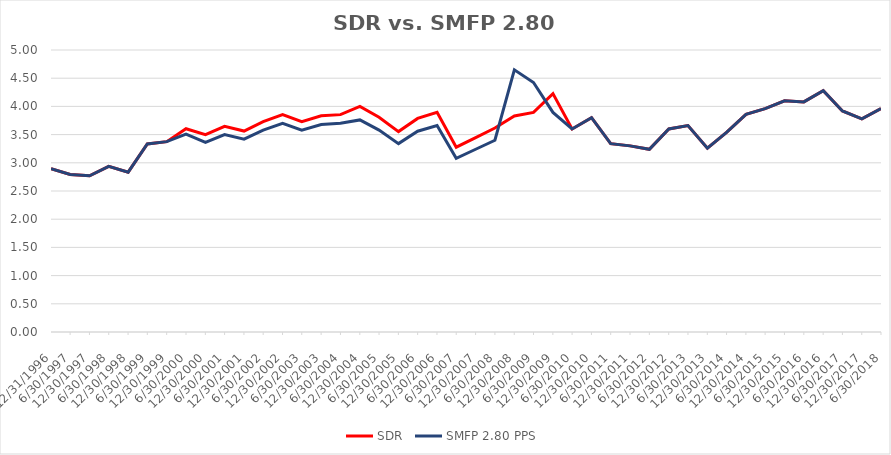
| Category | SDR | SMFP 2.80 PPS |
|---|---|---|
| 12/31/96 | 2.896 | 2.896 |
| 6/30/97 | 2.792 | 2.792 |
| 12/31/97 | 2.771 | 2.771 |
| 6/30/98 | 2.938 | 2.938 |
| 12/31/98 | 2.833 | 2.833 |
| 6/30/99 | 3.333 | 3.333 |
| 12/31/99 | 3.375 | 3.375 |
| 6/30/00 | 3.604 | 3.509 |
| 12/31/00 | 3.5 | 3.36 |
| 6/30/01 | 3.646 | 3.5 |
| 12/31/01 | 3.562 | 3.42 |
| 6/30/02 | 3.729 | 3.58 |
| 12/31/02 | 3.854 | 3.7 |
| 6/30/03 | 3.729 | 3.58 |
| 12/31/03 | 3.833 | 3.68 |
| 6/30/04 | 3.854 | 3.7 |
| 12/31/04 | 4 | 3.76 |
| 6/30/05 | 3.809 | 3.58 |
| 12/31/05 | 3.553 | 3.34 |
| 6/30/06 | 3.787 | 3.56 |
| 12/31/06 | 3.894 | 3.66 |
| 6/30/07 | 3.277 | 3.08 |
| 12/31/07 | 3.447 | 3.24 |
| 6/30/08 | 3.617 | 3.4 |
| 12/31/08 | 3.83 | 4.649 |
| 6/30/09 | 3.894 | 4.423 |
| 12/31/09 | 4.227 | 3.893 |
| 6/30/10 | 3.6 | 3.6 |
| 12/31/10 | 3.8 | 3.8 |
| 6/30/11 | 3.34 | 3.34 |
| 12/31/11 | 3.3 | 3.3 |
| 6/30/12 | 3.24 | 3.24 |
| 12/31/12 | 3.6 | 3.6 |
| 6/30/13 | 3.66 | 3.66 |
| 12/31/13 | 3.26 | 3.26 |
| 6/30/14 | 3.54 | 3.54 |
| 12/31/14 | 3.86 | 3.86 |
| 6/30/15 | 3.96 | 3.96 |
| 12/31/15 | 4.1 | 4.1 |
| 6/30/16 | 4.08 | 4.08 |
| 12/31/16 | 4.28 | 4.28 |
| 6/30/17 | 3.92 | 3.92 |
| 12/31/17 | 3.78 | 3.78 |
| 6/30/18 | 3.96 | 3.96 |